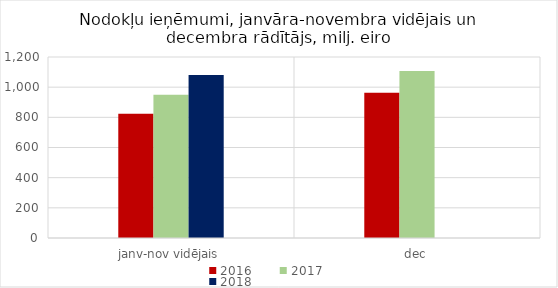
| Category | 2016 | 2017 | 2018 |
|---|---|---|---|
| janv-nov vidējais | 824369.827 | 949988.056 | 1080454.102 |
| dec | 962936.043 | 1107409.079 | 0 |